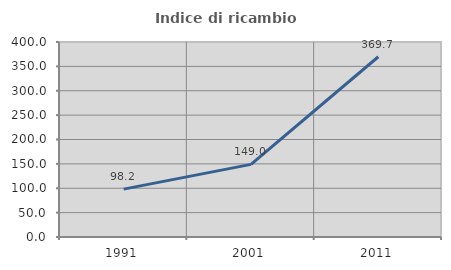
| Category | Indice di ricambio occupazionale  |
|---|---|
| 1991.0 | 98.198 |
| 2001.0 | 149.02 |
| 2011.0 | 369.737 |